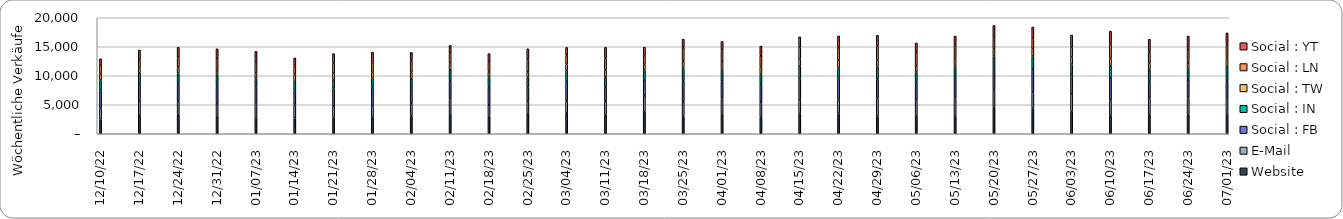
| Category | Website | E-Mail | Social : FB | Social : IN | Social : TW | Social : LN | Social : YT |
|---|---|---|---|---|---|---|---|
| 2023-07-01 | 3405.769 | 2749.101 | 3027.35 | 2359.552 | 1589.359 | 2181.473 | 2083.529 |
| 2023-06-24 | 3290.035 | 3034.584 | 2994.945 | 1805.776 | 1123.104 | 2224.187 | 2378.339 |
| 2023-06-17 | 3372.462 | 2747.206 | 2788.599 | 2156.807 | 1084.939 | 1917.162 | 2235.236 |
| 2023-06-10 | 3219.978 | 2577.707 | 3862.249 | 2069.062 | 1280.232 | 2543.222 | 2153.118 |
| 2023-06-03 | 3837.965 | 3049.05 | 3377.409 | 1727.084 | 1228.149 | 1705.762 | 2091.691 |
| 2023-05-27 | 4366.415 | 2797.037 | 4016.258 | 2193.755 | 1328.909 | 1750.785 | 1955.395 |
| 2023-05-20 | 4469.926 | 3065.51 | 3973.268 | 1878.12 | 1151.914 | 1982.46 | 2141.057 |
| 2023-05-13 | 3195.789 | 3086.372 | 3567.392 | 1796.083 | 1325.385 | 2353.488 | 1523.574 |
| 2023-05-06 | 3088.055 | 2681.625 | 3104.394 | 1756.434 | 1127.385 | 2389.567 | 1507.265 |
| 2023-04-29 | 3018.631 | 3125.718 | 3232.804 | 2242.758 | 1091.072 | 2424.603 | 1836.637 |
| 2023-04-22 | 3561.995 | 2364.669 | 3677.93 | 1719.033 | 1403.21 | 2078.83 | 2068.836 |
| 2023-04-15 | 3523.867 | 2287.943 | 3765.12 | 2115.902 | 1186.487 | 2056.578 | 1779.731 |
| 2023-04-08 | 2887.516 | 2644.933 | 3036.196 | 1682.428 | 1338.117 | 1858.496 | 1672.646 |
| 2023-04-01 | 3413.994 | 2692.101 | 2941.764 | 1954.725 | 1393.467 | 1993.432 | 1532.814 |
| 2023-03-25 | 2963.885 | 2538.832 | 3614.868 | 2163.56 | 1298.136 | 2259.292 | 1481.943 |
| 2023-03-18 | 3818.626 | 2733.273 | 2757.897 | 1666.861 | 954.657 | 1591.094 | 1414.937 |
| 2023-03-11 | 3339.262 | 2338.608 | 2398.572 | 1723.974 | 1248.007 | 2023.795 | 1821.416 |
| 2023-03-04 | 3603.838 | 2024.378 | 3262.734 | 2039.209 | 1067.804 | 1501.599 | 1384.808 |
| 2023-02-25 | 3433.215 | 2121.918 | 2464.872 | 1668.924 | 979.347 | 2200.779 | 1782.631 |
| 2023-02-18 | 2971.907 | 2028.445 | 2961.021 | 1796.208 | 968.864 | 1578.486 | 1518.612 |
| 2023-02-11 | 3392.418 | 2566.75 | 3159.077 | 1920.575 | 1130.806 | 1723.133 | 1340.813 |
| 2023-02-04 | 3068.439 | 2077.589 | 2727.501 | 1615.902 | 1076.085 | 1971.046 | 1486.275 |
| 2023-01-28 | 2877.49 | 1872.652 | 3260.453 | 1581.039 | 990.784 | 1721.575 | 1770.763 |
| 2023-01-21 | 2815.407 | 1988.164 | 3030.907 | 1459.841 | 1167.872 | 1720.526 | 1642.321 |
| 2023-01-14 | 2661.48 | 2413.901 | 2393.269 | 1530.179 | 1227.582 | 1564.565 | 1284.319 |
| 2023-01-07 | 2724.84 | 2587.067 | 2694.224 | 1564.827 | 847.048 | 1990.052 | 1806.355 |
| 2022-12-31 | 2968.269 | 2187.5 | 3015.385 | 1817.308 | 908.654 | 1951.923 | 1802.163 |
| 2022-12-24 | 3296.067 | 2272.289 | 3116.282 | 1731.268 | 1038.761 | 1714.621 | 1737.926 |
| 2022-12-17 | 3260.786 | 2419.24 | 2898.476 | 1943.297 | 790.494 | 1350.426 | 1778.61 |
| 2022-12-10 | 2463.401 | 1906.203 | 3128.128 | 1759.572 | 1104.62 | 1401.141 | 1173.048 |